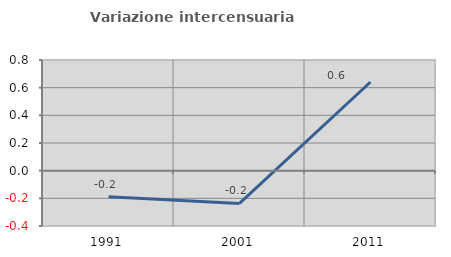
| Category | Variazione intercensuaria annua |
|---|---|
| 1991.0 | -0.188 |
| 2001.0 | -0.237 |
| 2011.0 | 0.641 |